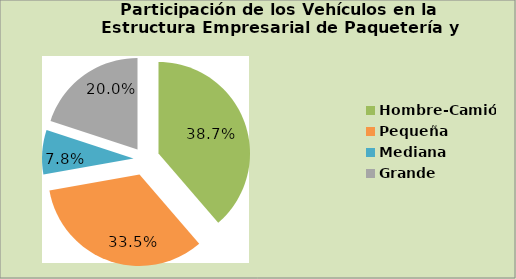
| Category | Series 0 |
|---|---|
| Hombre-Camión | 38.664 |
| Pequeña | 33.5 |
| Mediana | 7.832 |
| Grande | 19.951 |